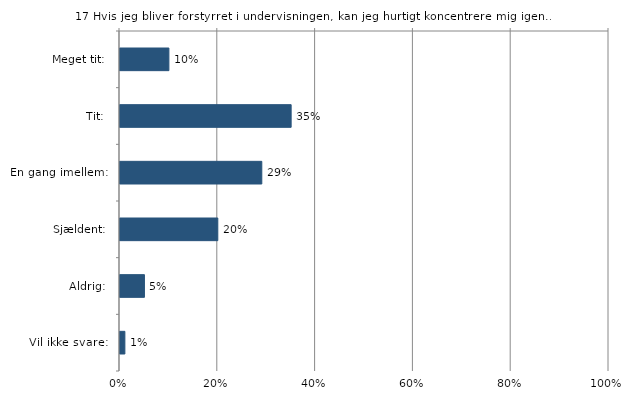
| Category | Hvis jeg bliver forstyrret i undervisningen, kan jeg hurtigt koncentrere mig igen. |
|---|---|
| Meget tit:  | 0.1 |
| Tit:  | 0.35 |
| En gang imellem:  | 0.29 |
| Sjældent:  | 0.2 |
| Aldrig:  | 0.05 |
| Vil ikke svare:  | 0.01 |